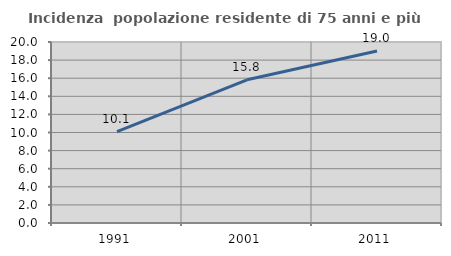
| Category | Incidenza  popolazione residente di 75 anni e più |
|---|---|
| 1991.0 | 10.104 |
| 2001.0 | 15.825 |
| 2011.0 | 18.996 |